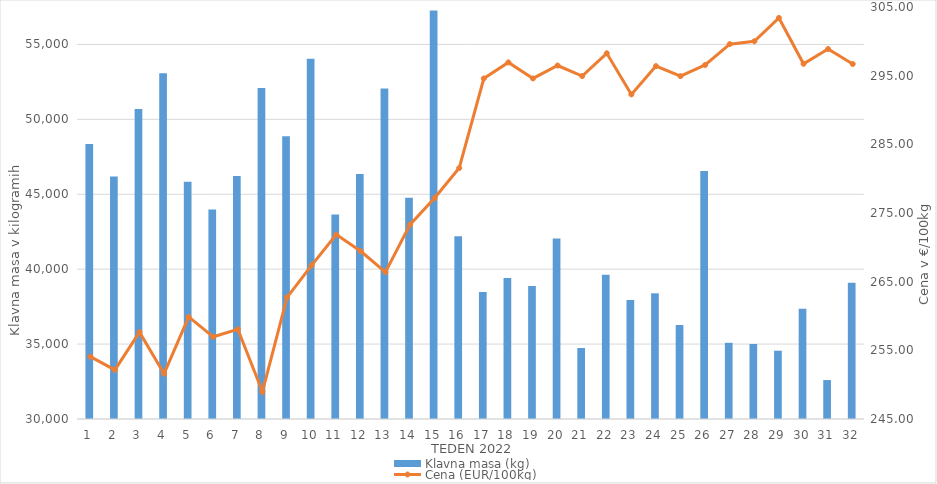
| Category | Klavna masa (kg) |
|---|---|
| 1.0 | 48349 |
| 2.0 | 46187 |
| 3.0 | 50692 |
| 4.0 | 53081 |
| 5.0 | 45844 |
| 6.0 | 43982 |
| 7.0 | 46227 |
| 8.0 | 52099 |
| 9.0 | 48872 |
| 10.0 | 54045 |
| 11.0 | 43645 |
| 12.0 | 46350 |
| 13.0 | 52061 |
| 14.0 | 44774 |
| 15.0 | 57268 |
| 16.0 | 42191 |
| 17.0 | 38469 |
| 18.0 | 39417 |
| 19.0 | 38876 |
| 20.0 | 42047 |
| 21.0 | 34739 |
| 22.0 | 39626 |
| 23.0 | 37939 |
| 24.0 | 38390 |
| 25.0 | 36272 |
| 26.0 | 46553 |
| 27.0 | 35085 |
| 28.0 | 35007 |
| 29.0 | 34559 |
| 30.0 | 37366 |
| 31.0 | 32599 |
| 32.0 | 39100 |